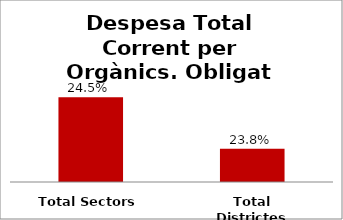
| Category | Series 0 |
|---|---|
| Total Sectors | 0.245 |
| Total Districtes | 0.238 |